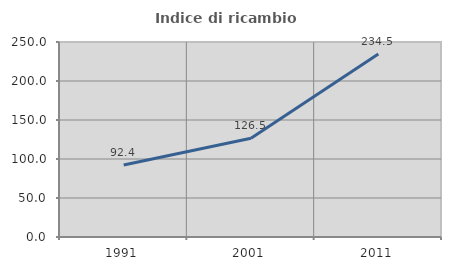
| Category | Indice di ricambio occupazionale  |
|---|---|
| 1991.0 | 92.398 |
| 2001.0 | 126.531 |
| 2011.0 | 234.513 |